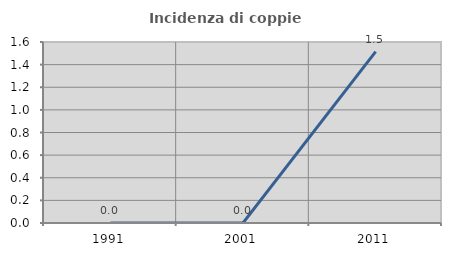
| Category | Incidenza di coppie miste |
|---|---|
| 1991.0 | 0 |
| 2001.0 | 0 |
| 2011.0 | 1.515 |